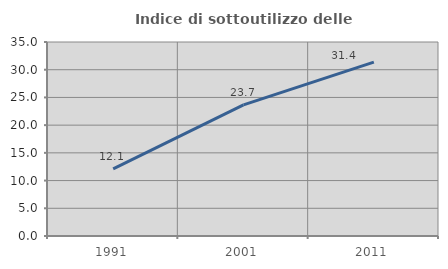
| Category | Indice di sottoutilizzo delle abitazioni  |
|---|---|
| 1991.0 | 12.095 |
| 2001.0 | 23.653 |
| 2011.0 | 31.382 |